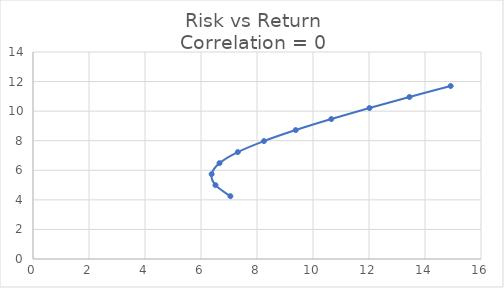
| Category | Return |
|---|---|
| 7.048936089935842 | 4.25 |
| 6.517052631366422 | 4.995 |
| 6.37968651267443 | 5.74 |
| 6.661289289619541 | 6.485 |
| 7.313624272547777 | 7.23 |
| 8.249204507102487 | 7.975 |
| 9.383687974352089 | 8.72 |
| 10.653721180883231 | 9.465 |
| 12.016401291568119 | 10.21 |
| 13.443584901357225 | 10.955 |
| 14.916769087171657 | 11.7 |